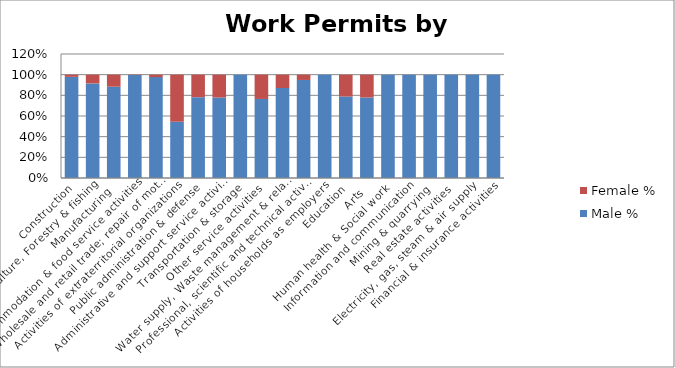
| Category | Male % | Female % |
|---|---|---|
| Construction | 0.979 | 0.021 |
| Agriculture, Forestry & fishing | 0.915 | 0.085 |
| Manufacturing | 0.883 | 0.117 |
| Accommodation & food service activities | 0.997 | 0.003 |
| Wholesale and retail trade; repair of motor vehicles  | 0.976 | 0.024 |
| Activities of extraterritorial organizations  | 0.545 | 0.455 |
| Public administration & defense | 0.782 | 0.218 |
| Administrative and support service activities | 0.779 | 0.221 |
|  Transportation & storage | 1 | 0 |
| Other service activities | 0.765 | 0.235 |
| Water supply, Waste management & related activities | 0.871 | 0.129 |
| Professional, scientific and technical activities | 0.949 | 0.051 |
| Activities of households as employers | 1 | 0 |
| Education | 0.788 | 0.212 |
| Arts | 0.779 | 0.221 |
| Human health & Social work | 1 | 0 |
|  Information and communication | 1 | 0 |
| Mining & quarrying | 1 | 0 |
| Real estate activities | 1 | 0 |
| Electricity, gas, steam & air supply | 1 | 0 |
| Financial & insurance activities | 1 | 0 |